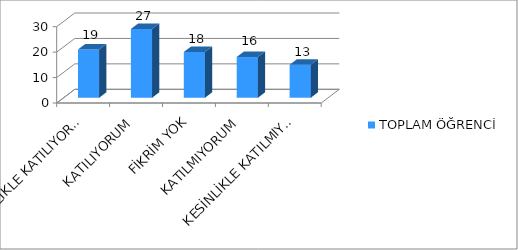
| Category | TOPLAM ÖĞRENCİ |
|---|---|
| KESİNLİKLE KATILIYORUM | 19 |
| KATILIYORUM | 27 |
| FİKRİM YOK | 18 |
| KATILMIYORUM | 16 |
| KESİNLİKLE KATILMIYORUM | 13 |